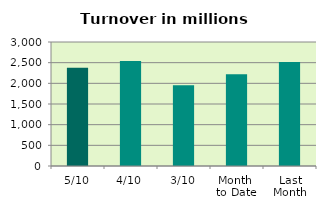
| Category | Series 0 |
|---|---|
| 5/10 | 2375.489 |
| 4/10 | 2539.875 |
| 3/10 | 1955.297 |
| Month 
to Date | 2217.553 |
| Last
Month | 2513.15 |